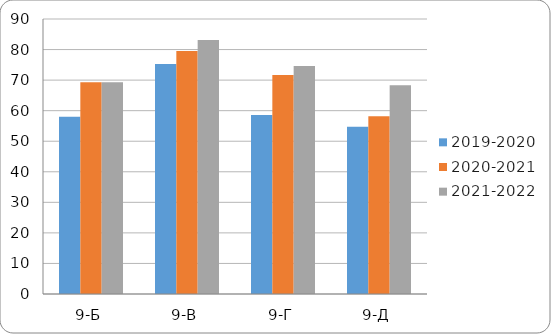
| Category | 2019-2020 | 2020-2021 | 2021-2022 |
|---|---|---|---|
| 9-Б | 58 | 69.3 | 69.3 |
| 9-В | 75.3 | 79.5 | 83.1 |
| 9-Г | 58.6 | 71.7 | 74.6 |
| 9-Д | 54.7 | 58.2 | 68.3 |